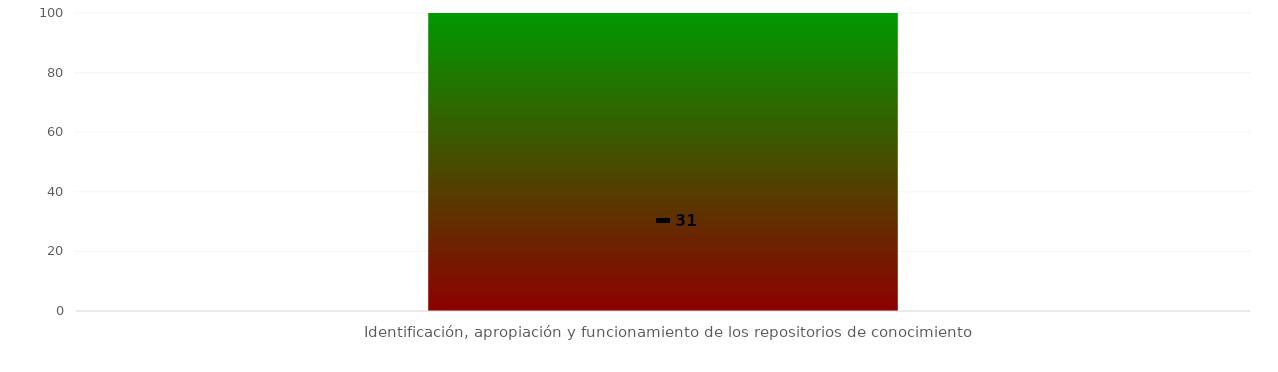
| Category | Niveles |
|---|---|
| Identificación, apropiación y funcionamiento de los repositorios de conocimiento | 100 |